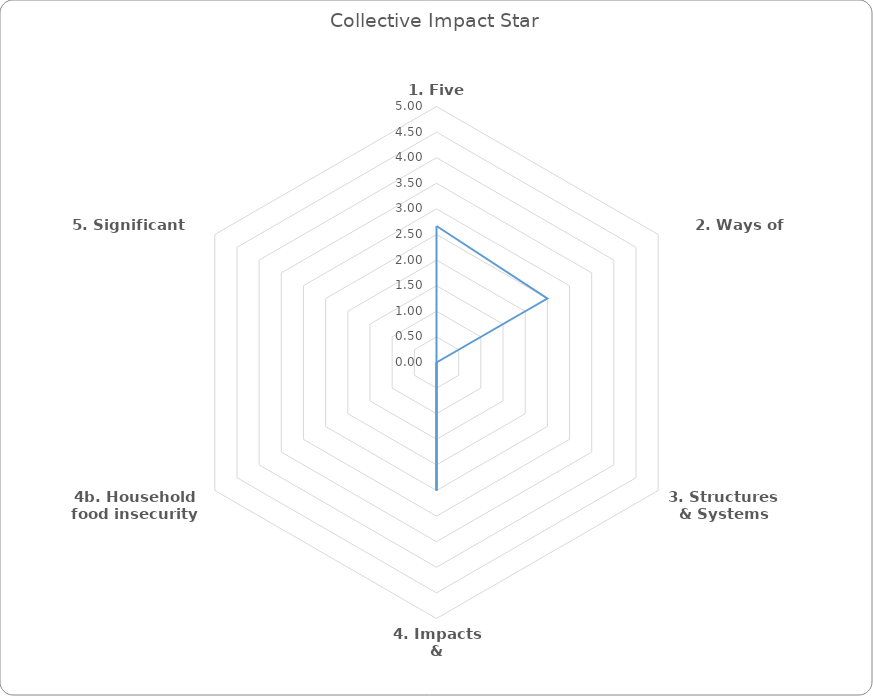
| Category | Series 0 |
|---|---|
| 1. Five Foundations | 2.667 |
| 2. Ways of Working | 2.5 |
| 3. Structures & Systems | 0 |
| 4. Impacts & Outcomes | 2.5 |
| 4b. Household food insecurity | 0 |
| 5. Significant Change | 0 |